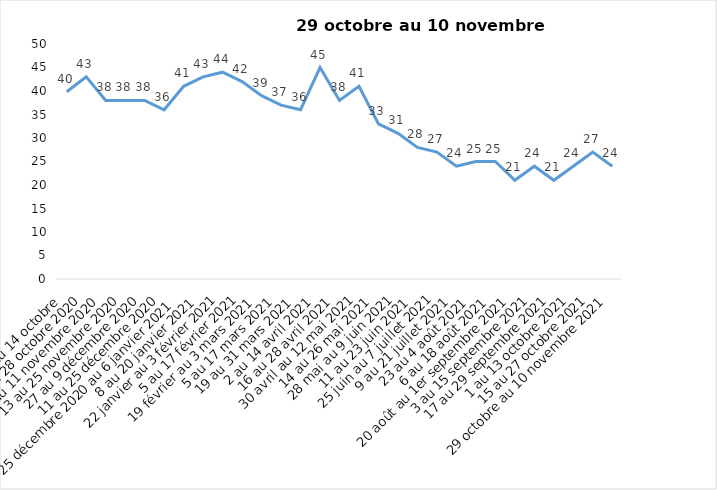
| Category | Toujours aux trois mesures |
|---|---|
| 2 au 14 octobre  | 39.85 |
| 16 au 28 octobre 2020 | 43 |
| 30 octobre au 11 novembre 2020 | 38 |
| 13 au 25 novembre 2020 | 38 |
| 27 au 9 décembre 2020 | 38 |
| 11 au 25 décembre 2020 | 36 |
| 25 décembre 2020 au 6 janvier 2021 | 41 |
| 8 au 20 janvier 2021 | 43 |
| 22 janvier au 3 février 2021 | 44 |
| 5 au 17 février 2021 | 42 |
| 19 février au 3 mars 2021 | 39 |
| 5 au 17 mars 2021 | 37 |
| 19 au 31 mars 2021 | 36 |
| 2 au 14 avril 2021 | 45 |
| 16 au 28 avril 2021 | 38 |
| 30 avril au 12 mai 2021 | 41 |
| 14 au 26 mai 2021 | 33 |
| 28 mai au 9 juin 2021 | 31 |
| 11 au 23 juin 2021 | 28 |
| 25 juin au 7 juillet 2021 | 27 |
| 9 au 21 juillet 2021 | 24 |
| 23 au 4 août 2021 | 25 |
| 6 au 18 août 2021 | 25 |
| 20 août au 1er septembre 2021 | 21 |
| 3 au 15 septembre 2021 | 24 |
| 17 au 29 septembre 2021 | 21 |
| 1 au 13 octobre 2021 | 24 |
| 15 au 27 octobre 2021 | 27 |
| 29 octobre au 10 novembre 2021 | 24 |